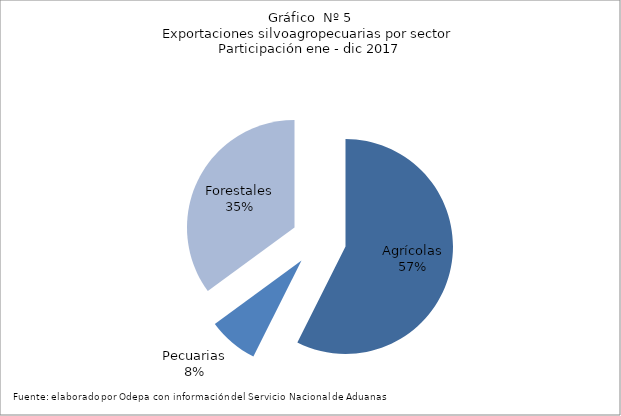
| Category | Series 0 |
|---|---|
| Agrícolas | 9008394 |
| Pecuarias | 1183191 |
| Forestales | 5505210 |